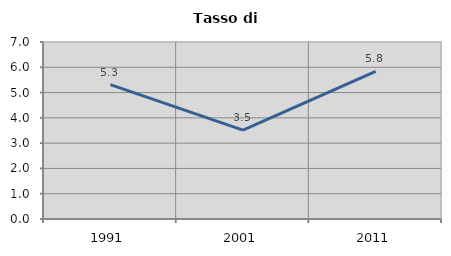
| Category | Tasso di disoccupazione   |
|---|---|
| 1991.0 | 5.316 |
| 2001.0 | 3.513 |
| 2011.0 | 5.837 |